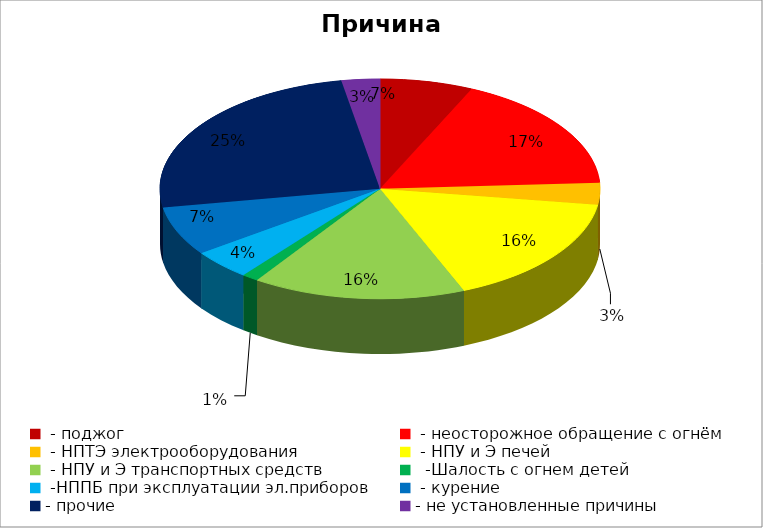
| Category | Причина пожара |
|---|---|
|  - поджог | 17 |
|  - неосторожное обращение с огнём | 43 |
|  - НПТЭ электрооборудования | 8 |
|  - НПУ и Э печей | 41 |
|  - НПУ и Э транспортных средств | 39 |
|   -Шалость с огнем детей | 3 |
|  -НППБ при эксплуатации эл.приборов | 11 |
|  - курение | 18 |
| - прочие | 62 |
| - не установленные причины | 7 |